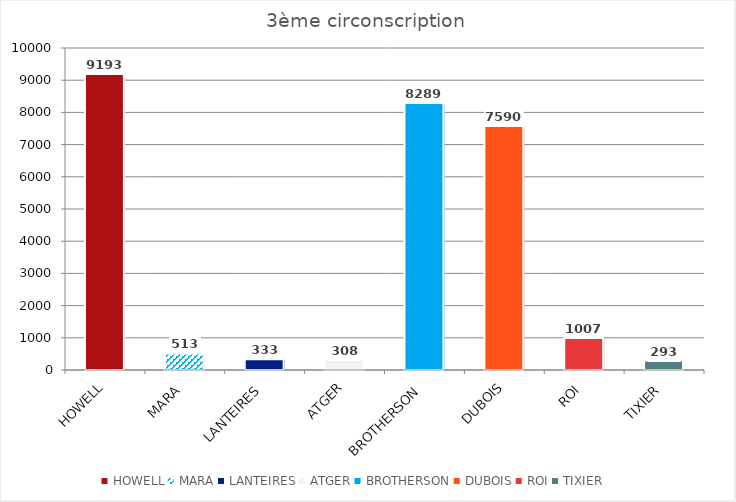
| Category | Series 0 |
|---|---|
| HOWELL | 9193 |
| MARA | 513 |
| LANTEIRES | 333 |
| ATGER | 308 |
| BROTHERSON | 8289 |
| DUBOIS | 7590 |
| ROI | 1007 |
| TIXIER | 293 |